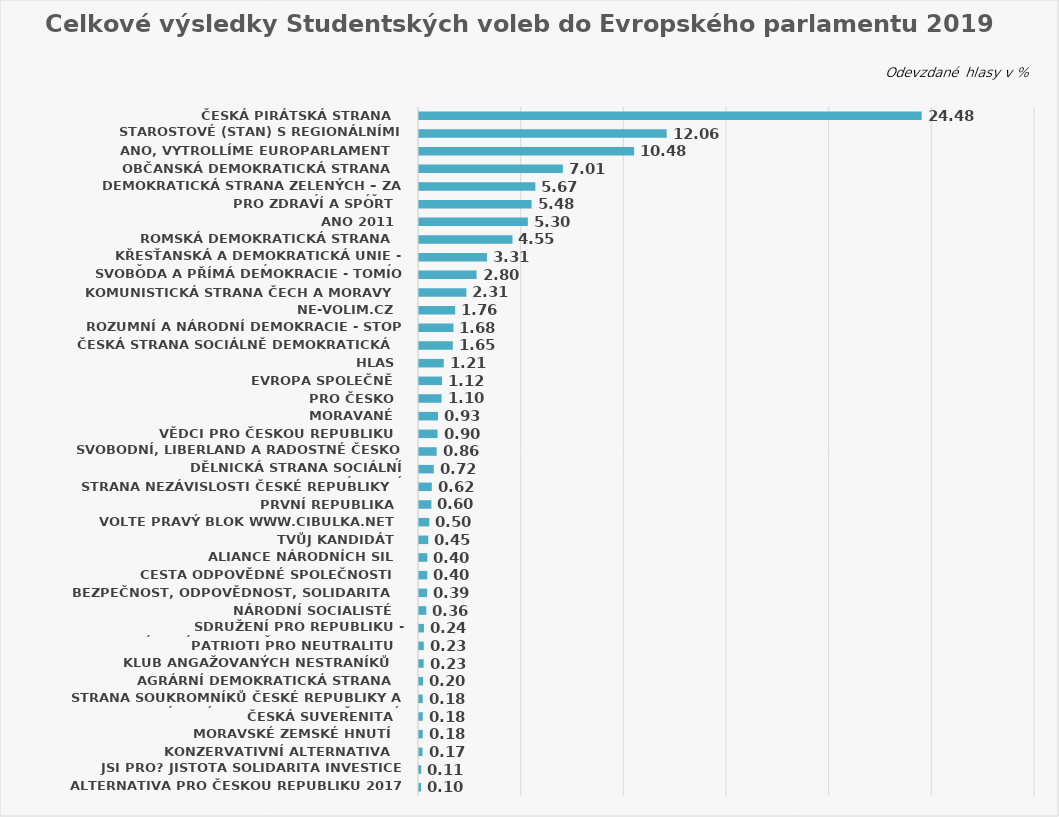
| Category | Series 0 |
|---|---|
| Česká pirátská strana  | 24.482 |
| STAROSTOVÉ (STAN) s regionálními partnery a TOP 09  | 12.063 |
| ANO, vytrollíme europarlament  | 10.476 |
| Občanská demokratická strana  | 7.006 |
| Demokratická strana zelených – ZA PRÁVA ZVÍŘAT  | 5.666 |
| PRO Zdraví a Sport  | 5.483 |
| ANO 2011  | 5.3 |
| Romská demokratická strana  | 4.552 |
| Křesťanská a demokratická unie - Československá strana lidová  | 3.309 |
| Svoboda a přímá demokracie - Tomio Okamura (SPD)  | 2.803 |
| Komunistická strana Čech a Moravy  | 2.308 |
| NE-VOLIM.CZ  | 1.759 |
| ROZUMNÍ a Národní demokracie - STOP MIGRACI - NECHCEME EURO  | 1.679 |
| Česká strana sociálně demokratická  | 1.646 |
| HLAS  | 1.205 |
| Evropa společně  | 1.119 |
| Pro Česko  | 1.098 |
| Moravané  | 0.925 |
| Vědci pro Českou republiku  | 0.904 |
| Svobodní, Liberland a Radostné Česko - ODEJDEME BEZ PLACENÍ  | 0.861 |
| Dělnická strana sociální spravedlnosti – Za národní suverenitu!  | 0.721 |
| Strana nezávislosti České republiky  | 0.624 |
| PRVNÍ REPUBLIKA  | 0.603 |
| Volte Pravý Blok www.cibulka.net | 0.5 |
| TVŮJ KANDIDÁT  | 0.452 |
| ALIANCE NÁRODNÍCH SIL  | 0.404 |
| CESTA ODPOVĚDNÉ SPOLEČNOSTI  | 0.404 |
| BEZPEČNOST, ODPOVĚDNOST, SOLIDARITA  | 0.393 |
| Národní socialisté  | 0.355 |
| Sdružení pro republiku - Republikánská strana Československa Miroslava Sládka  | 0.242 |
| PATRIOTI PRO NEUTRALITU  | 0.231 |
| Klub angažovaných nestraníků  | 0.226 |
| Agrární demokratická strana  | 0.199 |
| Strana soukromníků České republiky a NEZÁVISLÍ s podporou Občanské demokratické aliance a profesních společenstev  | 0.183 |
| Česká Suverenita  | 0.183 |
| Moravské zemské hnutí  | 0.183 |
| KONZERVATIVNÍ ALTERNATIVA  | 0.172 |
| JSI PRO? Jistota Solidarita Investice pro budoucnost  | 0.108 |
| Alternativa pro Českou republiku 2017 | 0.102 |